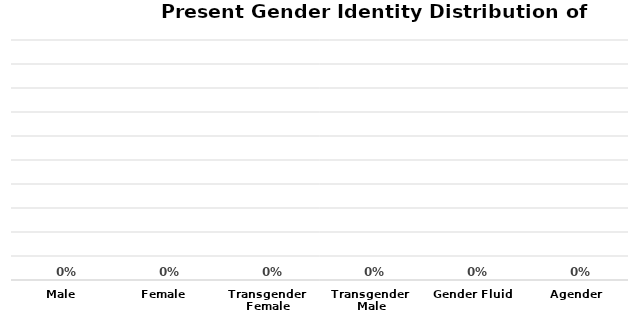
| Category | Series 2 |
|---|---|
| Male | 0 |
| Female | 0 |
| Transgender 
Female | 0 |
| Transgender 
Male | 0 |
| Gender Fluid | 0 |
| Agender | 0 |